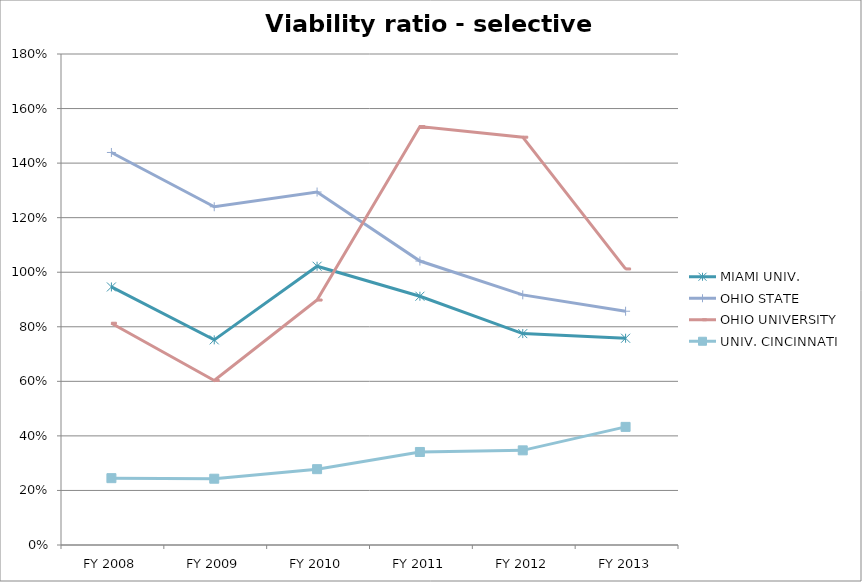
| Category | MIAMI UNIV.  | OHIO STATE  | OHIO UNIVERSITY  | UNIV. CINCINNATI  |
|---|---|---|---|---|
| FY 2013 | 0.758 | 0.857 | 1.012 | 0.433 |
| FY 2012 | 0.775 | 0.917 | 1.495 | 0.347 |
| FY 2011 | 0.912 | 1.041 | 1.534 | 0.341 |
| FY 2010 | 1.022 | 1.294 | 0.898 | 0.278 |
| FY 2009 | 0.752 | 1.24 | 0.603 | 0.243 |
| FY 2008 | 0.946 | 1.439 | 0.813 | 0.245 |